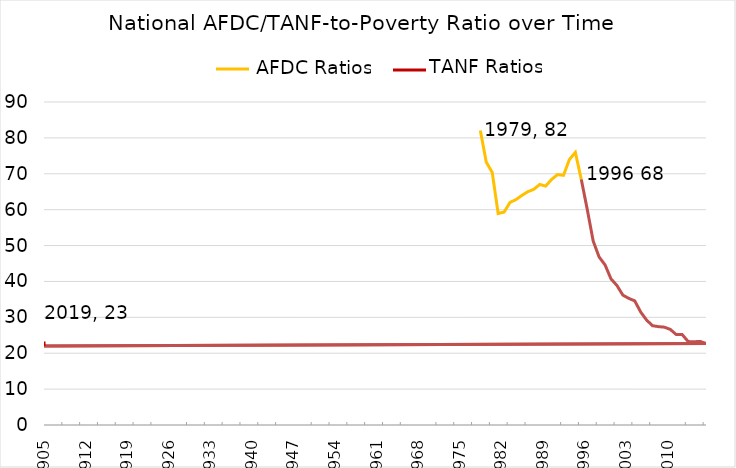
| Category | Series 0 |
|---|---|
| 1979-01-01 | 82.061 |
| 1980-01-01 | 73.245 |
| 1981-01-01 | 70.38 |
| 1982-01-01 | 58.928 |
| 1983-01-01 | 59.329 |
| 1984-01-01 | 62.017 |
| 1985-01-01 | 62.807 |
| 1986-01-01 | 63.968 |
| 1987-01-01 | 65.007 |
| 1988-01-01 | 65.658 |
| 1989-01-01 | 67.032 |
| 1990-01-01 | 66.57 |
| 1991-01-01 | 68.428 |
| 1992-01-01 | 69.77 |
| 1993-01-01 | 69.573 |
| 1994-01-01 | 73.982 |
| 1995-01-01 | 75.967 |
| 1996-01-01 | 68.434 |
| 1997-01-01 | 60.107 |
| 1998-01-01 | 51.281 |
| 1999-01-01 | 46.815 |
| 2000-01-01 | 44.625 |
| 2001-01-01 | 40.721 |
| 2002-01-01 | 38.883 |
| 2003-01-01 | 36.191 |
| 2004-01-01 | 35.279 |
| 2005-01-01 | 34.584 |
| 2006-01-01 | 31.487 |
| 2007-01-01 | 29.231 |
| 2008-01-01 | 27.663 |
| 2009-01-01 | 27.409 |
| 2010-01-01 | 27.258 |
| 2011-01-01 | 26.626 |
| 2012-01-01 | 25.192 |
| 2013-01-01 | 25.183 |
| 2014-01-01 | 23.248 |
| 2015-01-01 | 23.188 |
| 2016-01-01 | 23.299 |
| 2017-01-01 | 22.708 |
| 1905-07-10 | 22 |
| 1905-07-11 | 23.295 |